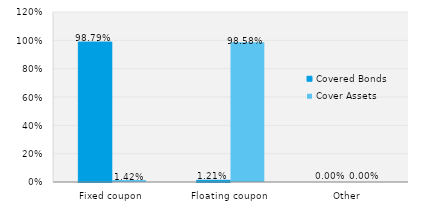
| Category | Covered Bonds | Cover Assets |
|---|---|---|
| Fixed coupon | 0.988 | 0.014 |
| Floating coupon | 0.012 | 0.986 |
| Other | 0 | 0 |